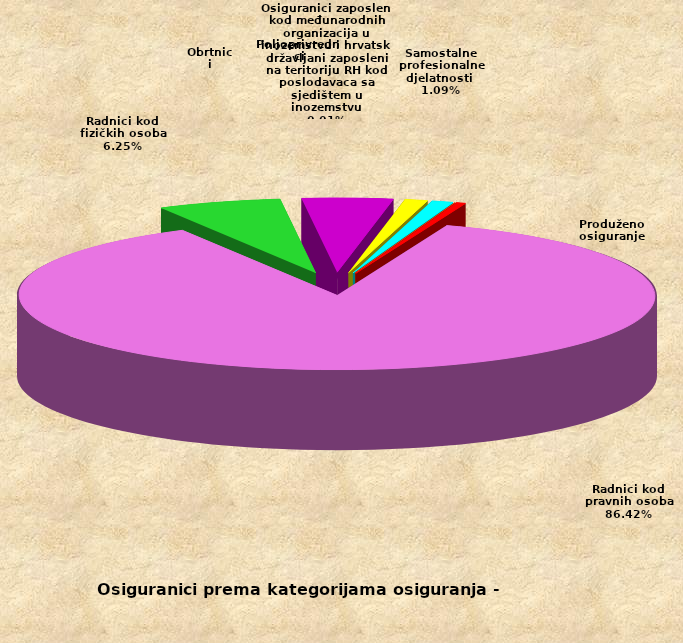
| Category | Series 0 |
|---|---|
| Radnici kod pravnih osoba | 1389388 |
| Radnici kod fizičkih osoba | 100500 |
| Obrtnici | 73742 |
| Poljoprivrednici | 18577 |
| Samostalne profesionalne djelatnosti  | 17584 |
| Osiguranici zaposleni kod međunarodnih organizacija u inozemstvu i hrvatski državljani zaposleni na teritoriju RH kod poslodavaca sa sjedištem u inozemstvu | 86 |
| Produženo osiguranje | 7857 |